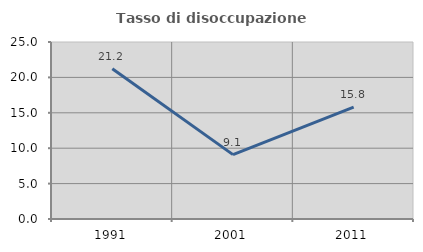
| Category | Tasso di disoccupazione giovanile  |
|---|---|
| 1991.0 | 21.212 |
| 2001.0 | 9.091 |
| 2011.0 | 15.789 |